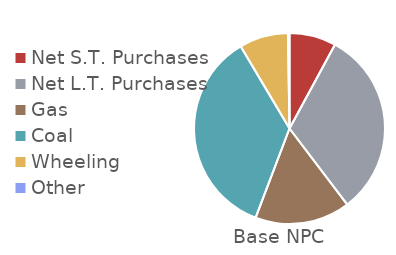
| Category | 2022 Base NPC |
|---|---|
| Net S.T. Purchases | -137906159.72 |
| Net L.T. Purchases | 553961677.04 |
| Gas | 281182712.621 |
| Coal  | 622677366.578 |
| Wheeling | 144274940.637 |
| Other | 4593633.919 |